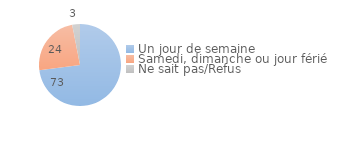
| Category | Series 0 |
|---|---|
| Un jour de semaine | 72.926 |
| Samedi, dimanche ou jour férié | 24.024 |
| Ne sait pas/Refus | 3.05 |